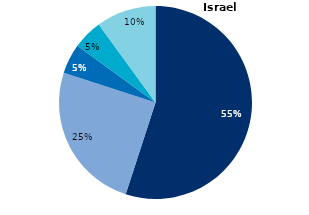
| Category | Series 0 |
|---|---|
| Venture capital/Business angel | 0.55 |
| Personal fund/Loan | 0.25 |
| Government fund/Grant | 0.05 |
| Initial Coin Offering/Security Token Offering | 0.05 |
| Other | 0.1 |